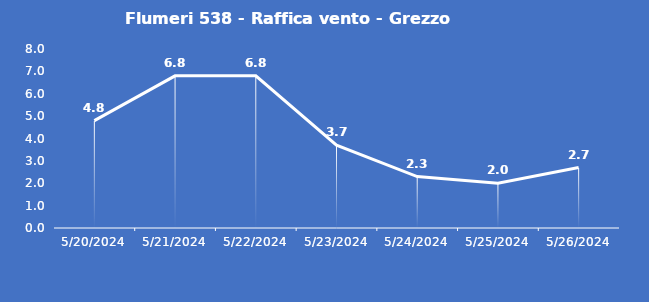
| Category | Flumeri 538 - Raffica vento - Grezzo (m/s) |
|---|---|
| 5/20/24 | 4.8 |
| 5/21/24 | 6.8 |
| 5/22/24 | 6.8 |
| 5/23/24 | 3.7 |
| 5/24/24 | 2.3 |
| 5/25/24 | 2 |
| 5/26/24 | 2.7 |